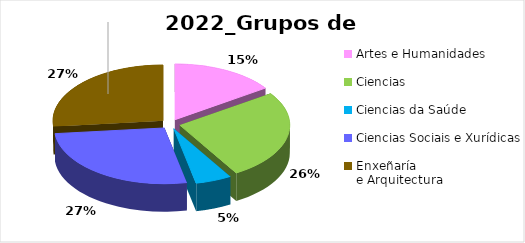
| Category | Series 0 |
|---|---|
| Artes e Humanidades | 26 |
| Ciencias | 44 |
| Ciencias da Saúde | 9 |
| Ciencias Sociais e Xurídicas | 45 |
| Enxeñaría 
e Arquitectura | 45 |